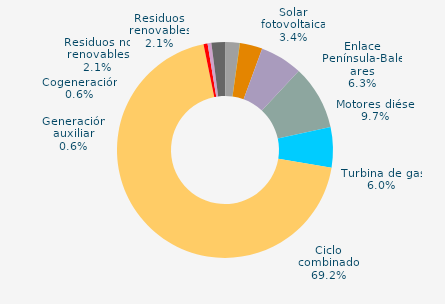
| Category | Series 0 |
|---|---|
| Carbón | 0 |
| Motores diésel | 9.652 |
| Turbina de gas | 6.022 |
| Ciclo combinado | 69.191 |
| Generación auxiliar | 0.606 |
| Cogeneración | 0.564 |
| Residuos no renovables | 2.105 |
| Residuos renovables | 2.105 |
| Eólica | 0.032 |
| Solar fotovoltaica | 3.373 |
| Otras renovables | 0.013 |
| Enlace Península-Baleares | 6.337 |